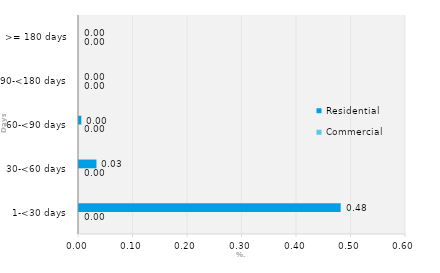
| Category | Commercial | Residential |
|---|---|---|
| 1-<30 days | 0 | 0.48 |
| 30-<60 days | 0 | 0.032 |
| 60-<90 days | 0 | 0.004 |
| 90-<180 days | 0 | 0 |
| >= 180 days | 0 | 0 |